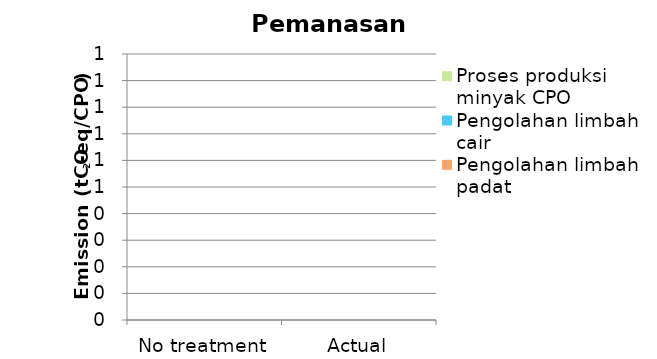
| Category | Pengolahan limbah padat | Pengolahan limbah cair | Proses produksi minyak CPO |
|---|---|---|---|
| No treatment | 0 | 0 | 0 |
| Actual | 0 | 0 | 0 |